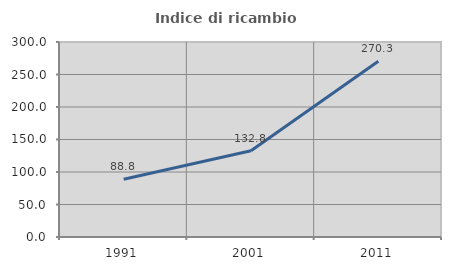
| Category | Indice di ricambio occupazionale  |
|---|---|
| 1991.0 | 88.756 |
| 2001.0 | 132.787 |
| 2011.0 | 270.345 |